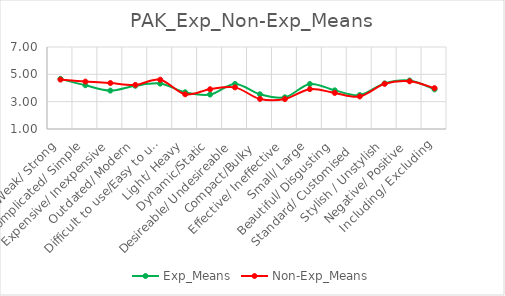
| Category | Exp_Means | Non-Exp_Means |
|---|---|---|
| Weak/ Strong | 4.669 | 4.615 |
| Complicated/ Simple | 4.201 | 4.469 |
| Expensive/ Inexpensive | 3.808 | 4.364 |
| Outdated/ Modern | 4.162 | 4.226 |
| Difficult to use/Easy to use | 4.321 | 4.607 |
| Light/ Heavy | 3.688 | 3.54 |
| Dynamic/Static | 3.523 | 3.908 |
| Desireable/ Undesireable | 4.295 | 4.046 |
| Compact/Bulky  | 3.542 | 3.197 |
| Effective/ Ineffective | 3.318 | 3.192 |
| Small/ Large | 4.292 | 3.916 |
| Beautiful/ Disgusting | 3.828 | 3.64 |
| Standard/ Customised   | 3.484 | 3.381 |
| Stylish / Unstylish | 4.338 | 4.305 |
| Negative/ Positive | 4.549 | 4.49 |
| Including/ Excluding | 3.899 | 3.987 |